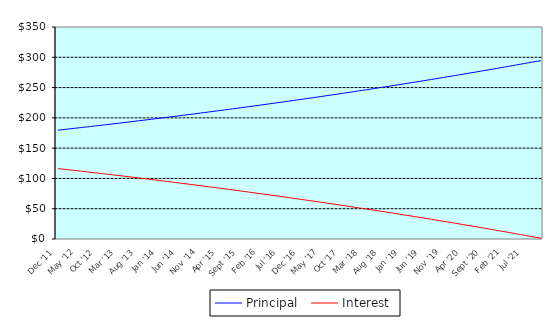
| Category | Principal | Interest |
|---|---|---|
| 0 | 179.67 | 116.25 |
| 1900-01-01 | 180.42 | 115.5 |
| 1900-01-02 | 181.17 | 114.75 |
| 1900-01-03 | 181.93 | 113.99 |
| 1900-01-04 | 182.69 | 113.23 |
| 1900-01-05 | 183.45 | 112.47 |
| 1900-01-06 | 184.21 | 111.71 |
| 1900-01-07 | 184.98 | 110.94 |
| 1900-01-08 | 185.75 | 110.17 |
| 1900-01-09 | 186.52 | 109.4 |
| 1900-01-10 | 187.3 | 108.62 |
| 1900-01-11 | 188.08 | 107.84 |
| 1900-01-12 | 188.86 | 107.06 |
| 1900-01-13 | 189.65 | 106.27 |
| 1900-01-14 | 190.44 | 105.48 |
| 1900-01-15 | 191.24 | 104.68 |
| 1900-01-16 | 192.03 | 103.89 |
| 1900-01-17 | 192.83 | 103.09 |
| 1900-01-18 | 193.64 | 102.28 |
| 1900-01-19 | 194.44 | 101.48 |
| 1900-01-20 | 195.25 | 100.67 |
| 1900-01-21 | 196.07 | 99.85 |
| 1900-01-22 | 196.88 | 99.04 |
| 1900-01-23 | 197.7 | 98.22 |
| 1900-01-24 | 198.53 | 97.39 |
| 1900-01-25 | 199.35 | 96.57 |
| 1900-01-26 | 200.19 | 95.73 |
| 1900-01-27 | 201.02 | 94.9 |
| 1900-01-28 | 201.86 | 94.06 |
| 1900-01-29 | 202.7 | 93.22 |
| 1900-01-30 | 203.54 | 92.38 |
| 1900-01-31 | 204.39 | 91.53 |
| 1900-02-01 | 205.24 | 90.68 |
| 1900-02-02 | 206.1 | 89.82 |
| 1900-02-03 | 206.96 | 88.96 |
| 1900-02-04 | 207.82 | 88.1 |
| 1900-02-05 | 208.68 | 87.24 |
| 1900-02-06 | 209.55 | 86.37 |
| 1900-02-07 | 210.43 | 85.49 |
| 1900-02-08 | 211.3 | 84.62 |
| 1900-02-09 | 212.18 | 83.74 |
| 1900-02-10 | 213.07 | 82.85 |
| 1900-02-11 | 213.96 | 81.96 |
| 1900-02-12 | 214.85 | 81.07 |
| 1900-02-13 | 215.74 | 80.18 |
| 1900-02-14 | 216.64 | 79.28 |
| 1900-02-15 | 217.54 | 78.38 |
| 1900-02-16 | 218.45 | 77.47 |
| 1900-02-17 | 219.36 | 76.56 |
| 1900-02-18 | 220.28 | 75.64 |
| 1900-02-19 | 221.19 | 74.73 |
| 1900-02-20 | 222.11 | 73.81 |
| 1900-02-21 | 223.04 | 72.88 |
| 1900-02-22 | 223.97 | 71.95 |
| 1900-02-23 | 224.9 | 71.02 |
| 1900-02-24 | 225.84 | 70.08 |
| 1900-02-25 | 226.78 | 69.14 |
| 1900-02-26 | 227.73 | 68.19 |
| 1900-02-27 | 228.67 | 67.25 |
| 1900-02-28 | 229.63 | 66.29 |
| 1900-02-28 | 230.58 | 65.34 |
| 1900-03-01 | 231.54 | 64.38 |
| 1900-03-02 | 232.51 | 63.41 |
| 1900-03-03 | 233.48 | 62.44 |
| 1900-03-04 | 234.45 | 61.47 |
| 1900-03-05 | 235.43 | 60.49 |
| 1900-03-06 | 236.41 | 59.51 |
| 1900-03-07 | 237.39 | 58.53 |
| 1900-03-08 | 238.38 | 57.54 |
| 1900-03-09 | 239.38 | 56.54 |
| 1900-03-10 | 240.37 | 55.55 |
| 1900-03-11 | 241.38 | 54.54 |
| 1900-03-12 | 242.38 | 53.54 |
| 1900-03-13 | 243.39 | 52.53 |
| 1900-03-14 | 244.41 | 51.51 |
| 1900-03-15 | 245.42 | 50.5 |
| 1900-03-16 | 246.45 | 49.47 |
| 1900-03-17 | 247.47 | 48.45 |
| 1900-03-18 | 248.5 | 47.42 |
| 1900-03-19 | 249.54 | 46.38 |
| 1900-03-20 | 250.58 | 45.34 |
| 1900-03-21 | 251.62 | 44.3 |
| 1900-03-22 | 252.67 | 43.25 |
| 1900-03-23 | 253.72 | 42.2 |
| 1900-03-24 | 254.78 | 41.14 |
| 1900-03-25 | 255.84 | 40.08 |
| 1900-03-26 | 256.91 | 39.01 |
| 1900-03-27 | 257.98 | 37.94 |
| 1900-03-28 | 259.05 | 36.87 |
| 1900-03-29 | 260.13 | 35.79 |
| 1900-03-30 | 261.22 | 34.7 |
| 1900-03-31 | 262.31 | 33.61 |
| 1900-04-01 | 263.4 | 32.52 |
| 1900-04-02 | 264.5 | 31.42 |
| 1900-04-03 | 265.6 | 30.32 |
| 1900-04-04 | 266.71 | 29.21 |
| 1900-04-05 | 267.82 | 28.1 |
| 1900-04-06 | 268.93 | 26.99 |
| 1900-04-07 | 270.05 | 25.87 |
| 1900-04-08 | 271.18 | 24.74 |
| 1900-04-09 | 272.31 | 23.61 |
| 1900-04-10 | 273.44 | 22.48 |
| 1900-04-11 | 274.58 | 21.34 |
| 1900-04-12 | 275.73 | 20.19 |
| 1900-04-13 | 276.88 | 19.04 |
| 1900-04-14 | 278.03 | 17.89 |
| 1900-04-15 | 279.19 | 16.73 |
| 1900-04-16 | 280.35 | 15.57 |
| 1900-04-17 | 281.52 | 14.4 |
| 1900-04-18 | 282.69 | 13.23 |
| 1900-04-19 | 283.87 | 12.05 |
| 1900-04-20 | 285.05 | 10.87 |
| 1900-04-21 | 286.24 | 9.68 |
| 1900-04-22 | 287.43 | 8.49 |
| 1900-04-23 | 288.63 | 7.29 |
| 1900-04-24 | 289.83 | 6.09 |
| 1900-04-25 | 291.04 | 4.88 |
| 1900-04-26 | 292.25 | 3.67 |
| 1900-04-27 | 293.47 | 2.45 |
| 1900-04-28 | 294.2 | 1.23 |